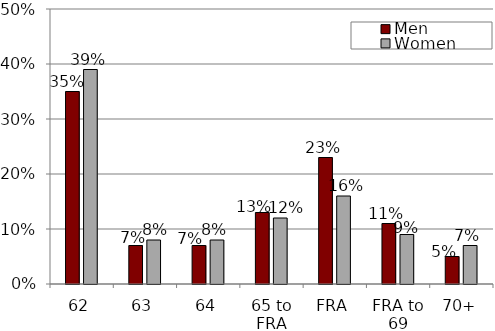
| Category | Men | Women |
|---|---|---|
| 62 | 0.35 | 0.39 |
| 63 | 0.07 | 0.08 |
| 64 | 0.07 | 0.08 |
| 65 to FRA | 0.13 | 0.12 |
| FRA | 0.23 | 0.16 |
| FRA to 69 | 0.11 | 0.09 |
| 70+ | 0.05 | 0.07 |